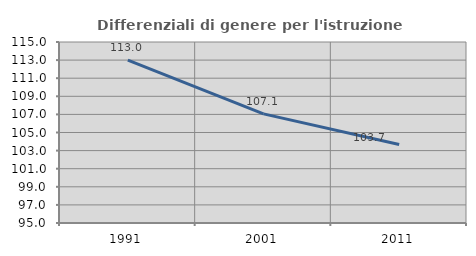
| Category | Differenziali di genere per l'istruzione superiore |
|---|---|
| 1991.0 | 113.003 |
| 2001.0 | 107.06 |
| 2011.0 | 103.672 |